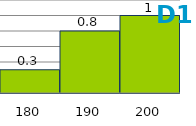
| Category | Series 1 |
|---|---|
| 180.0 | 0.3 |
| 190.0 | 0.8 |
| 200.0 | 1 |